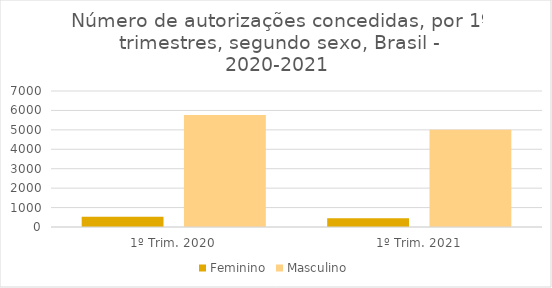
| Category | Feminino | Masculino |
|---|---|---|
| 1º Trim. 2020 | 526 | 5764 |
| 1º Trim. 2021 | 450 | 5010 |